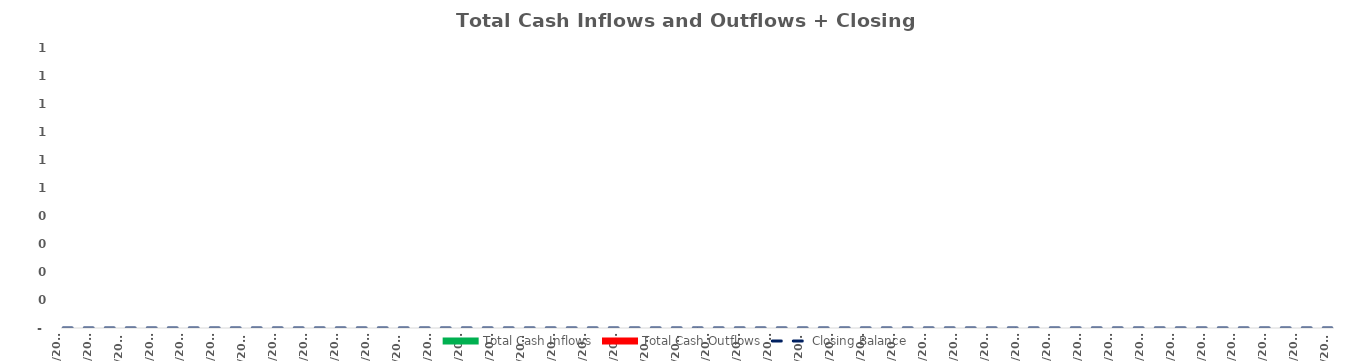
| Category | Total Cash Inflows | Total Cash Outflows |
|---|---|---|
| 3/22/20 | 0 | 0 |
| 3/29/20 | 0 | 0 |
| 4/5/20 | 0 | 0 |
| 4/12/20 | 0 | 0 |
| 4/19/20 | 0 | 0 |
| 4/26/20 | 0 | 0 |
| 5/3/20 | 0 | 0 |
| 5/10/20 | 0 | 0 |
| 5/17/20 | 0 | 0 |
| 5/24/20 | 0 | 0 |
| 5/31/20 | 0 | 0 |
| 6/7/20 | 0 | 0 |
| 6/14/20 | 0 | 0 |
| 6/21/20 | 0 | 0 |
| 6/28/20 | 0 | 0 |
| 7/5/20 | 0 | 0 |
| 7/12/20 | 0 | 0 |
| 7/19/20 | 0 | 0 |
| 7/26/20 | 0 | 0 |
| 8/2/20 | 0 | 0 |
| 8/9/20 | 0 | 0 |
| 8/16/20 | 0 | 0 |
| 8/23/20 | 0 | 0 |
| 8/30/20 | 0 | 0 |
| 9/6/20 | 0 | 0 |
| 9/13/20 | 0 | 0 |
| 9/20/20 | 0 | 0 |
| 9/27/20 | 0 | 0 |
| 10/4/20 | 0 | 0 |
| 10/11/20 | 0 | 0 |
| 10/18/20 | 0 | 0 |
| 10/25/20 | 0 | 0 |
| 11/1/20 | 0 | 0 |
| 11/8/20 | 0 | 0 |
| 11/15/20 | 0 | 0 |
| 11/22/20 | 0 | 0 |
| 11/29/20 | 0 | 0 |
| 12/6/20 | 0 | 0 |
| 12/13/20 | 0 | 0 |
| 12/20/20 | 0 | 0 |
| 12/27/20 | 0 | 0 |
| 1/3/21 | 0 | 0 |